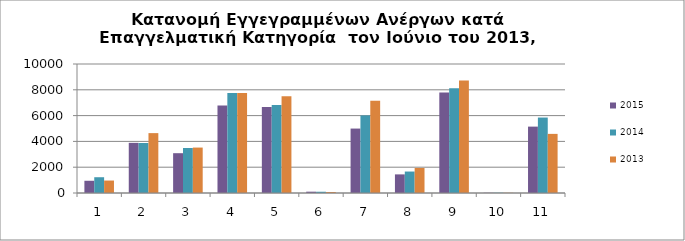
| Category | 2015 | 2014 | 2013 |
|---|---|---|---|
| 1.0 | 948 | 1223 | 966 |
| 2.0 | 3887 | 3877 | 4642 |
| 3.0 | 3086 | 3487 | 3522 |
| 4.0 | 6786 | 7748 | 7743 |
| 5.0 | 6673 | 6821 | 7503 |
| 6.0 | 102 | 97 | 78 |
| 7.0 | 4995 | 6015 | 7147 |
| 8.0 | 1443 | 1664 | 1942 |
| 9.0 | 7792 | 8124 | 8722 |
| 10.0 | 18 | 20 | 15 |
| 11.0 | 5146 | 5849 | 4583 |